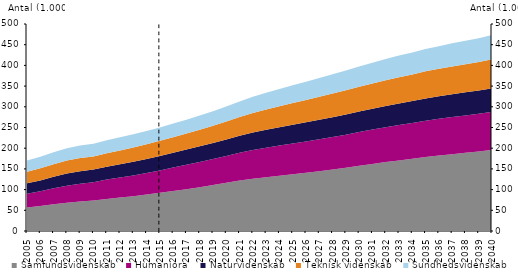
| Category | Samfundsvidenskab | Humaniora | Naturvidenskab | Teknisk videnskab | Sundhedsvidenskab |
|---|---|---|---|---|---|
| 2005.0 | 56871 | 33318 | 25125 | 27700 | 27420 |
| 2006.0 | 60458 | 35794 | 25944 | 29101 | 28218 |
| 2007.0 | 64416 | 38581 | 27779 | 30425 | 29111 |
| 2008.0 | 68487 | 41051 | 29302 | 31661 | 29640 |
| 2009.0 | 71486 | 42760 | 30112 | 32186 | 30182 |
| 2010.0 | 73791 | 44248 | 30502 | 31556 | 30592 |
| 2011.0 | 77517 | 46601 | 31294 | 32607 | 31195 |
| 2012.0 | 80735 | 48379 | 32053 | 33412 | 31674 |
| 2013.0 | 84012 | 50172 | 32868 | 34351 | 32060 |
| 2014.0 | 88141 | 52166 | 33868 | 35322 | 32293 |
| 2015.0 | 92120 | 54219 | 34920 | 36537 | 32488 |
| 2016.0 | 96638.356 | 56577.896 | 35892.675 | 37573.553 | 32886.834 |
| 2017.0 | 101120.653 | 58646.911 | 36834.584 | 38698.208 | 33452.54 |
| 2018.0 | 105888.813 | 60732.847 | 37827.423 | 40116.136 | 34174.585 |
| 2019.0 | 110924.913 | 62835.417 | 38860.315 | 41660.206 | 34980.035 |
| 2020.0 | 116280.787 | 64971.037 | 39949.572 | 43506.085 | 36235.105 |
| 2021.0 | 121704.356 | 67046.024 | 41058.52 | 45522.405 | 37647.049 |
| 2022.0 | 126312.534 | 69148.952 | 42221.993 | 47430.781 | 39081.34 |
| 2023.0 | 130084.547 | 71009.273 | 43316.072 | 49168.817 | 40390.948 |
| 2024.0 | 133726.555 | 72684.852 | 44348.3 | 50844.497 | 41668.645 |
| 2025.0 | 137129.954 | 74245.278 | 45318.54 | 52445.805 | 42913.875 |
| 2026.0 | 140531.18 | 75711.164 | 46234.015 | 53941.7 | 44096.361 |
| 2027.0 | 144329.481 | 77185.152 | 47150.668 | 55438.342 | 45292.452 |
| 2028.0 | 148379.614 | 78619.811 | 48032.543 | 56843.4 | 46505.322 |
| 2029.0 | 152765.675 | 79978.753 | 48870.936 | 58153.911 | 47692.926 |
| 2030.0 | 157537.712 | 81514.244 | 49841.775 | 59605.722 | 48940.238 |
| 2031.0 | 161987.036 | 82885.494 | 50701.225 | 60894.211 | 50013.38 |
| 2032.0 | 166386.16 | 84219.238 | 51531.354 | 62129.207 | 51138.516 |
| 2033.0 | 170535.655 | 85377.954 | 52282.051 | 63262.964 | 52224.12 |
| 2034.0 | 174381.375 | 86427.306 | 52963.49 | 64288.355 | 53016.327 |
| 2035.0 | 178625.647 | 87672.155 | 53800.489 | 65492.25 | 54139.112 |
| 2036.0 | 182213.5 | 88630.544 | 54461.236 | 66452.942 | 54788.474 |
| 2037.0 | 185635.406 | 89513.465 | 55088.679 | 67337.299 | 55754.872 |
| 2038.0 | 188946.594 | 90277.276 | 55688.799 | 68111.126 | 56686.259 |
| 2039.0 | 192157.408 | 90930.596 | 56268.111 | 68882.479 | 57576.787 |
| 2040.0 | 195821.768 | 91831.815 | 57004.828 | 69879.37 | 58537.813 |